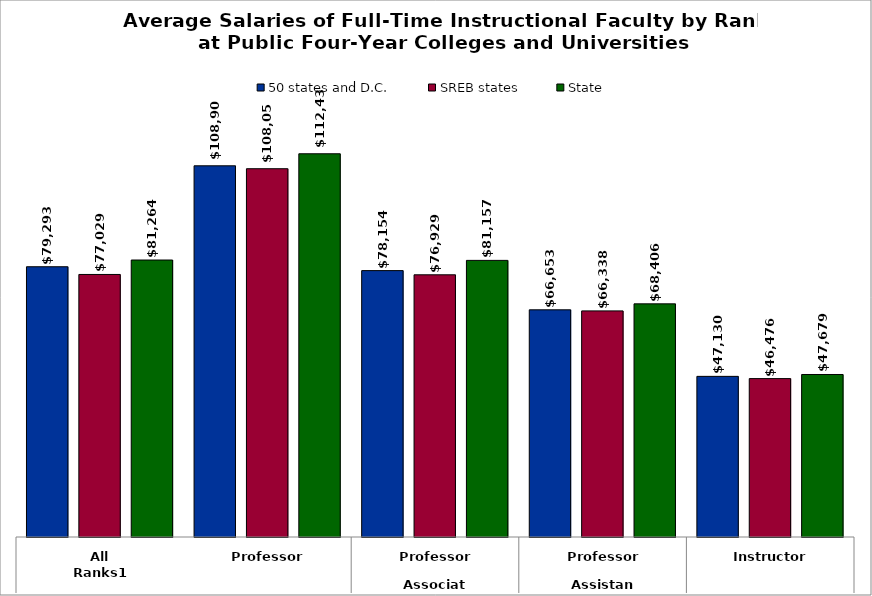
| Category | 50 states and D.C. | SREB states | State |
|---|---|---|---|
| 0 | 79293.426 | 77028.697 | 81264.435 |
| 1 | 108907.495 | 108057.276 | 112438.549 |
| 2 | 78154.118 | 76928.808 | 81157.457 |
| 3 | 66653.208 | 66338.457 | 68405.941 |
| 4 | 47130.052 | 46475.976 | 47679.187 |